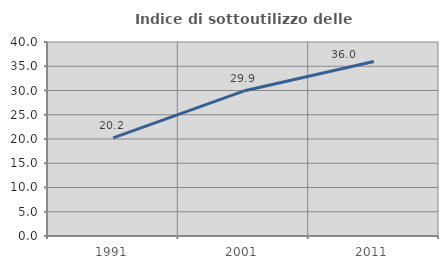
| Category | Indice di sottoutilizzo delle abitazioni  |
|---|---|
| 1991.0 | 20.247 |
| 2001.0 | 29.884 |
| 2011.0 | 35.97 |